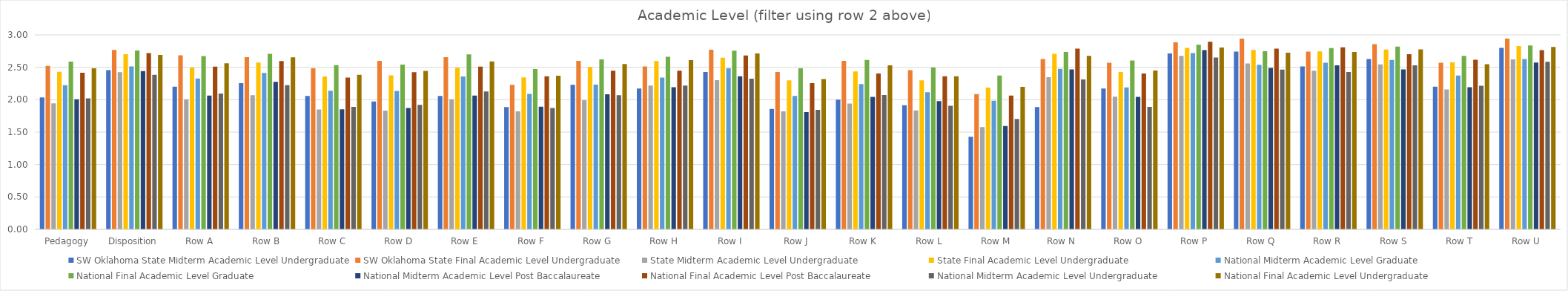
| Category | SW Oklahoma State | State | National |
|---|---|---|---|
| Pedagogy | 2.521 | 2.432 | 2.484 |
| Disposition | 2.768 | 2.703 | 2.691 |
| Row A | 2.686 | 2.496 | 2.562 |
| Row B | 2.657 | 2.574 | 2.655 |
| Row C | 2.486 | 2.359 | 2.386 |
| Row D | 2.6 | 2.377 | 2.444 |
| Row E | 2.657 | 2.493 | 2.592 |
| Row F | 2.229 | 2.345 | 2.37 |
| Row G | 2.6 | 2.504 | 2.55 |
| Row H | 2.514 | 2.595 | 2.61 |
| Row I | 2.771 | 2.648 | 2.715 |
| Row J | 2.429 | 2.299 | 2.319 |
| Row K | 2.6 | 2.437 | 2.532 |
| Row L | 2.457 | 2.299 | 2.362 |
| Row M | 2.086 | 2.187 | 2.2 |
| Row N | 2.629 | 2.708 | 2.675 |
| Row O | 2.571 | 2.426 | 2.451 |
| Row P | 2.886 | 2.799 | 2.805 |
| Row Q | 2.943 | 2.768 | 2.724 |
| Row R | 2.743 | 2.746 | 2.737 |
| Row S | 2.857 | 2.775 | 2.778 |
| Row T | 2.571 | 2.578 | 2.548 |
| Row U | 2.943 | 2.828 | 2.813 |